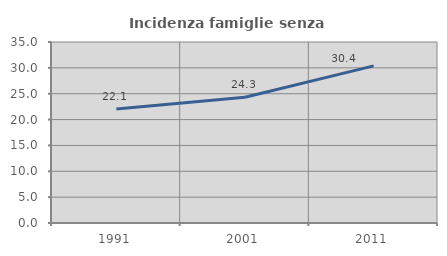
| Category | Incidenza famiglie senza nuclei |
|---|---|
| 1991.0 | 22.064 |
| 2001.0 | 24.302 |
| 2011.0 | 30.39 |